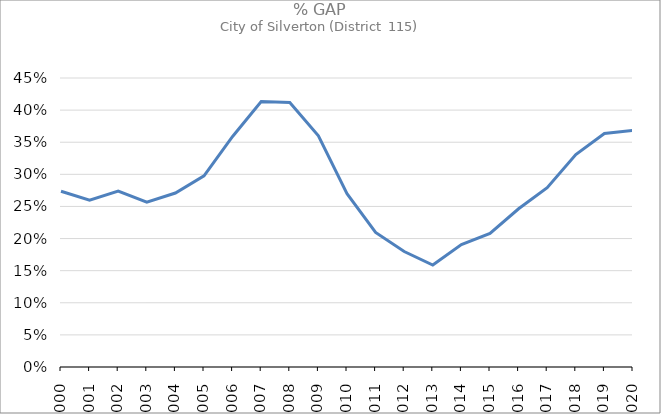
| Category | Series 2 |
|---|---|
| 2000.0 | 0.274 |
| 2001.0 | 0.26 |
| 2002.0 | 0.274 |
| 2003.0 | 0.257 |
| 2004.0 | 0.271 |
| 2005.0 | 0.298 |
| 2006.0 | 0.359 |
| 2007.0 | 0.413 |
| 2008.0 | 0.412 |
| 2009.0 | 0.36 |
| 2010.0 | 0.27 |
| 2011.0 | 0.21 |
| 2012.0 | 0.18 |
| 2013.0 | 0.159 |
| 2014.0 | 0.191 |
| 2015.0 | 0.208 |
| 2016.0 | 0.246 |
| 2017.0 | 0.279 |
| 2018.0 | 0.331 |
| 2019.0 | 0.364 |
| 2020.0 | 0.368 |